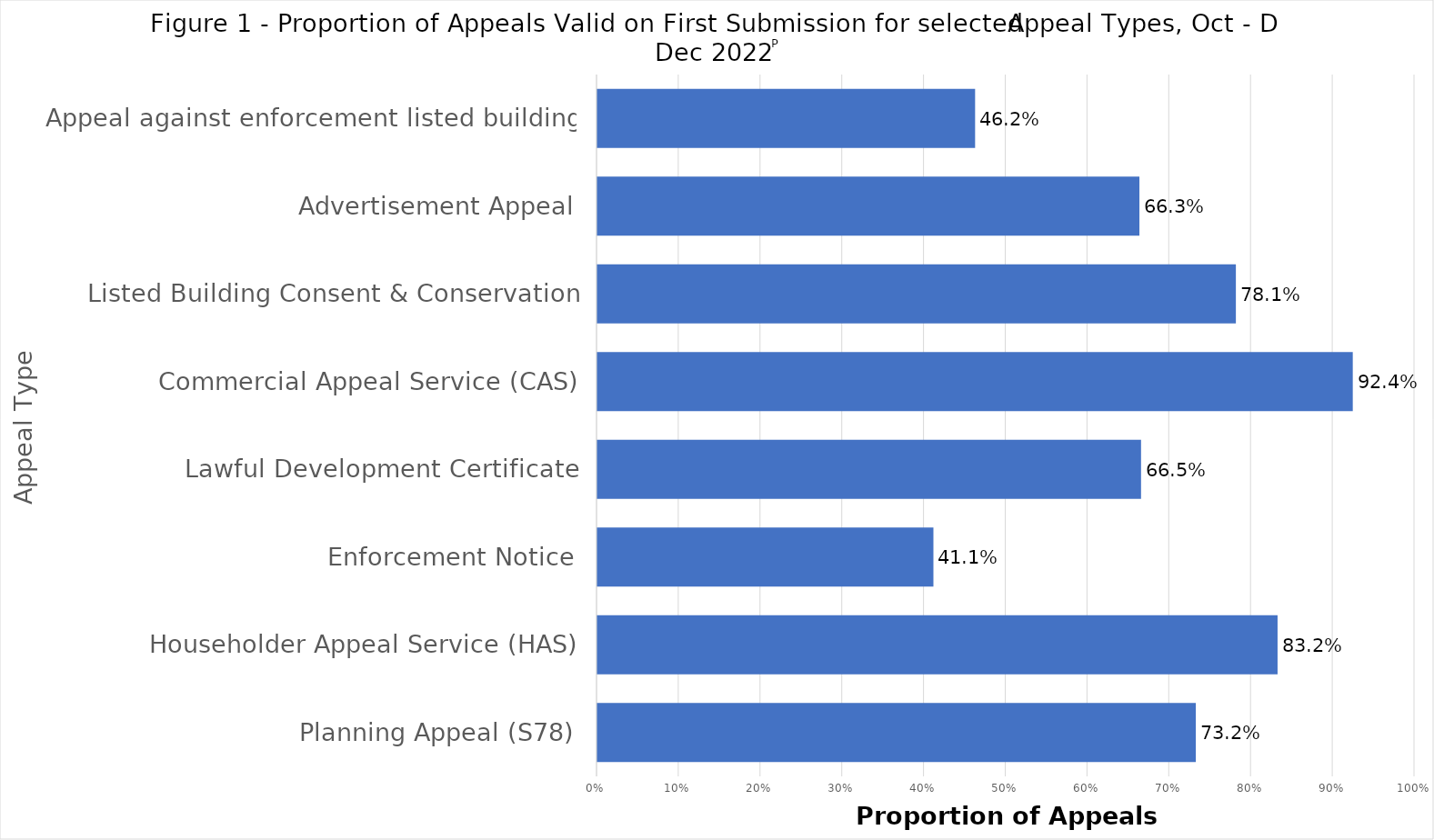
| Category | Proportion valid on first submission |
|---|---|
| Planning Appeal (S78) | 0.732 |
| Householder Appeal Service (HAS) | 0.832 |
| Enforcement Notice | 0.411 |
| Lawful Development Certificate | 0.665 |
| Commercial Appeal Service (CAS) | 0.924 |
| Listed Building Consent & Conservation | 0.781 |
| Advertisement Appeal | 0.663 |
| Appeal against enforcement listed building | 0.462 |